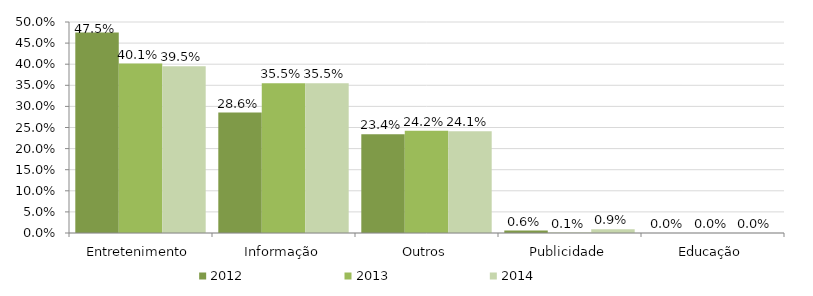
| Category | 2012 | 2013 | 2014 |
|---|---|---|---|
| Entretenimento | 0.475 | 0.401 | 0.395 |
| Informação | 0.286 | 0.355 | 0.355 |
| Outros | 0.234 | 0.242 | 0.241 |
| Publicidade | 0.006 | 0.001 | 0.009 |
| Educação | 0 | 0 | 0 |